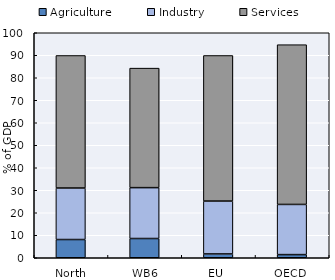
| Category | Agriculture | Industry | Services |
|---|---|---|---|
| North Macedonia | 8.1 | 22.9 | 58.9 |
| WB6 Average | 8.55 | 22.617 | 53.117 |
| EU | 1.7 | 23.5 | 64.7 |
| OECD | 1.4 | 22.3 | 71 |